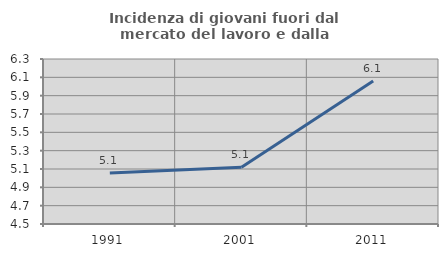
| Category | Incidenza di giovani fuori dal mercato del lavoro e dalla formazione  |
|---|---|
| 1991.0 | 5.056 |
| 2001.0 | 5.118 |
| 2011.0 | 6.06 |